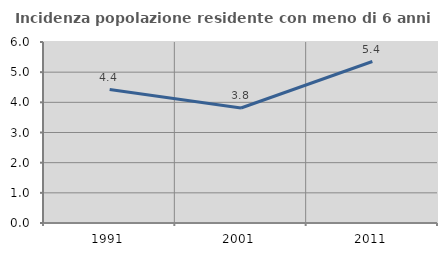
| Category | Incidenza popolazione residente con meno di 6 anni |
|---|---|
| 1991.0 | 4.423 |
| 2001.0 | 3.813 |
| 2011.0 | 5.353 |